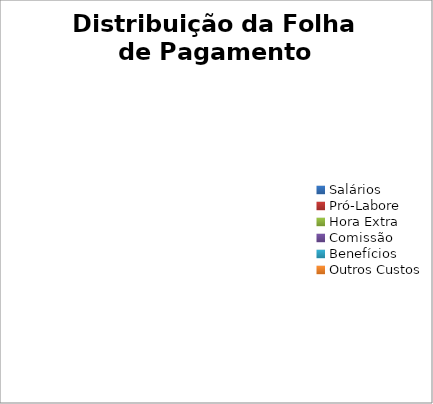
| Category | Salários |
|---|---|
| Salários | 0 |
| Pró-Labore | 0 |
| Hora Extra | 0 |
| Comissão | 0 |
| Benefícios | 0 |
| Outros Custos | 0 |